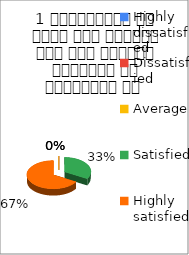
| Category | 1 व्याख्यान से रूचि में वृद्धि हुई एवं शिक्षण जानकारी से परिपूर्ण था  |
|---|---|
| Highly dissatisfied | 0 |
| Dissatisfied | 0 |
| Average | 0 |
| Satisfied | 2 |
| Highly satisfied | 4 |